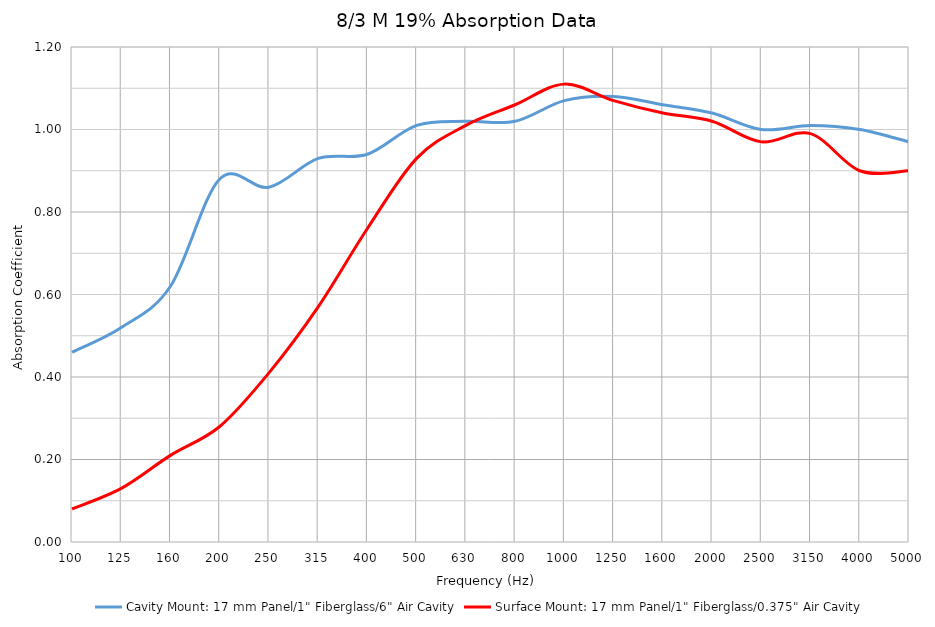
| Category | Cavity Mount: 17 mm Panel/1" Fiberglass/6" Air Cavity | Surface Mount: 17 mm Panel/1" Fiberglass/0.375" Air Cavity |
|---|---|---|
| 100.0 | 0.46 | 0.08 |
| 125.0 | 0.52 | 0.13 |
| 160.0 | 0.62 | 0.21 |
| 200.0 | 0.88 | 0.28 |
| 250.0 | 0.86 | 0.41 |
| 315.0 | 0.93 | 0.57 |
| 400.0 | 0.94 | 0.76 |
| 500.0 | 1.01 | 0.93 |
| 630.0 | 1.02 | 1.01 |
| 800.0 | 1.02 | 1.06 |
| 1000.0 | 1.07 | 1.11 |
| 1250.0 | 1.08 | 1.07 |
| 1600.0 | 1.06 | 1.04 |
| 2000.0 | 1.04 | 1.02 |
| 2500.0 | 1 | 0.97 |
| 3150.0 | 1.01 | 0.99 |
| 4000.0 | 1 | 0.9 |
| 5000.0 | 0.97 | 0.9 |